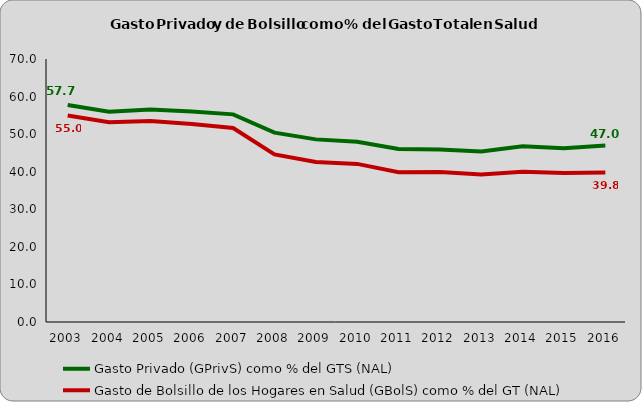
| Category | Gasto Privado (GPrivS) como % del GTS (NAL) | Gasto de Bolsillo de los Hogares en Salud (GBolS) como % del GT (NAL) |
|---|---|---|
| 2003.0 | 57.748 | 54.957 |
| 2004.0 | 55.969 | 53.149 |
| 2005.0 | 56.591 | 53.481 |
| 2006.0 | 56.019 | 52.679 |
| 2007.0 | 55.267 | 51.643 |
| 2008.0 | 50.409 | 44.593 |
| 2009.0 | 48.607 | 42.603 |
| 2010.0 | 47.954 | 42.077 |
| 2011.0 | 46.026 | 39.876 |
| 2012.0 | 45.902 | 39.899 |
| 2013.0 | 45.373 | 39.283 |
| 2014.0 | 46.753 | 39.963 |
| 2015.0 | 46.247 | 39.65 |
| 2016.0 | 46.958 | 39.775 |